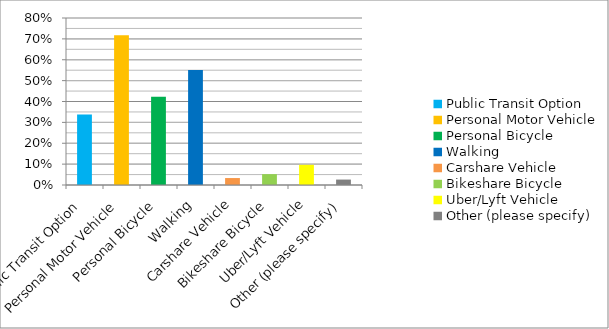
| Category | Responses |
|---|---|
| Public Transit Option | 0.337 |
| Personal Motor Vehicle | 0.717 |
| Personal Bicycle | 0.423 |
| Walking | 0.551 |
| Carshare Vehicle | 0.033 |
| Bikeshare Bicycle | 0.052 |
| Uber/Lyft Vehicle | 0.097 |
| Other (please specify) | 0.026 |